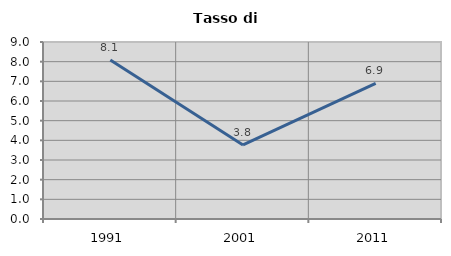
| Category | Tasso di disoccupazione   |
|---|---|
| 1991.0 | 8.088 |
| 2001.0 | 3.763 |
| 2011.0 | 6.892 |